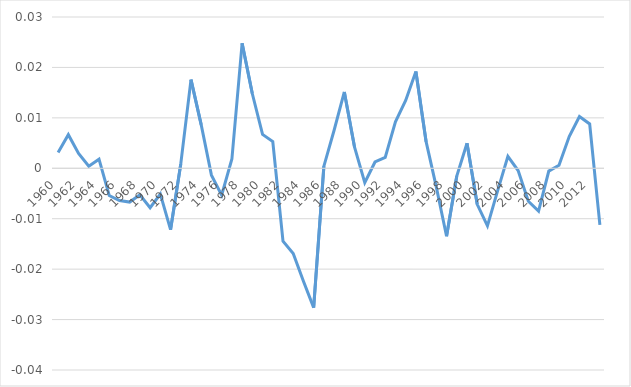
| Category | BC |
|---|---|
| 1960.0 | 0.003 |
| 1961.0 | 0.007 |
| 1962.0 | 0.003 |
| 1963.0 | 0 |
| 1964.0 | 0.002 |
| 1965.0 | -0.005 |
| 1966.0 | -0.006 |
| 1967.0 | -0.007 |
| 1968.0 | -0.005 |
| 1969.0 | -0.008 |
| 1970.0 | -0.005 |
| 1971.0 | -0.012 |
| 1972.0 | 0.001 |
| 1973.0 | 0.018 |
| 1974.0 | 0.009 |
| 1975.0 | -0.001 |
| 1976.0 | -0.005 |
| 1977.0 | 0.002 |
| 1978.0 | 0.025 |
| 1979.0 | 0.015 |
| 1980.0 | 0.007 |
| 1981.0 | 0.005 |
| 1982.0 | -0.014 |
| 1983.0 | -0.017 |
| 1984.0 | -0.022 |
| 1985.0 | -0.028 |
| 1986.0 | 0 |
| 1987.0 | 0.008 |
| 1988.0 | 0.015 |
| 1989.0 | 0.004 |
| 1990.0 | -0.003 |
| 1991.0 | 0.001 |
| 1992.0 | 0.002 |
| 1993.0 | 0.009 |
| 1994.0 | 0.013 |
| 1995.0 | 0.019 |
| 1996.0 | 0.005 |
| 1997.0 | -0.004 |
| 1998.0 | -0.013 |
| 1999.0 | -0.002 |
| 2000.0 | 0.005 |
| 2001.0 | -0.007 |
| 2002.0 | -0.011 |
| 2003.0 | -0.004 |
| 2004.0 | 0.002 |
| 2005.0 | 0 |
| 2006.0 | -0.007 |
| 2007.0 | -0.008 |
| 2008.0 | -0.001 |
| 2009.0 | 0.001 |
| 2010.0 | 0.006 |
| 2011.0 | 0.01 |
| 2012.0 | 0.009 |
| 2013.0 | -0.011 |